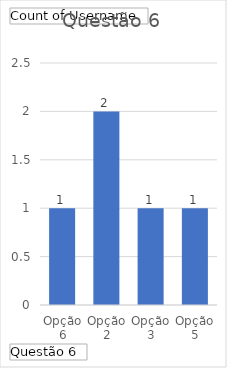
| Category | Total |
|---|---|
| Opção 6 | 1 |
| Opção 2 | 2 |
| Opção 3 | 1 |
| Opção 5 | 1 |